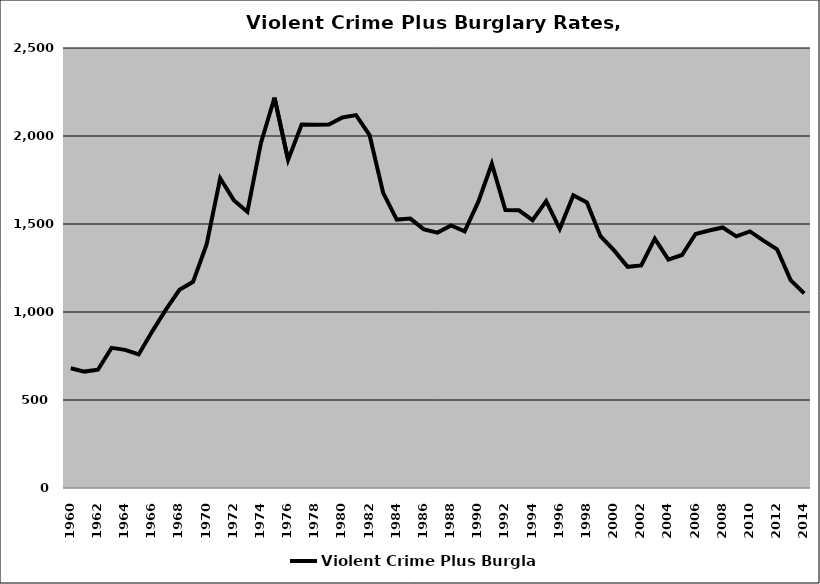
| Category | Violent Crime Plus Burglary |
|---|---|
| 1960.0 | 680.272 |
| 1961.0 | 661.354 |
| 1962.0 | 672.068 |
| 1963.0 | 796.218 |
| 1964.0 | 784.929 |
| 1965.0 | 759.01 |
| 1966.0 | 890.234 |
| 1967.0 | 1012.977 |
| 1968.0 | 1126.217 |
| 1969.0 | 1171.296 |
| 1970.0 | 1383.679 |
| 1971.0 | 1759.677 |
| 1972.0 | 1635.398 |
| 1973.0 | 1569.444 |
| 1974.0 | 1960.908 |
| 1975.0 | 2218.307 |
| 1976.0 | 1864.261 |
| 1977.0 | 2064.777 |
| 1978.0 | 2064.322 |
| 1979.0 | 2064.777 |
| 1980.0 | 2105.32 |
| 1981.0 | 2118.896 |
| 1982.0 | 2004.651 |
| 1983.0 | 1676.568 |
| 1984.0 | 1525.122 |
| 1985.0 | 1530.707 |
| 1986.0 | 1469.352 |
| 1987.0 | 1451.242 |
| 1988.0 | 1492.273 |
| 1989.0 | 1458.692 |
| 1990.0 | 1625.716 |
| 1991.0 | 1841.912 |
| 1992.0 | 1578.81 |
| 1993.0 | 1577.857 |
| 1994.0 | 1522.238 |
| 1995.0 | 1630.265 |
| 1996.0 | 1472.414 |
| 1997.0 | 1663.115 |
| 1998.0 | 1621.909 |
| 1999.0 | 1430.452 |
| 2000.0 | 1350.051 |
| 2001.0 | 1256.843 |
| 2002.0 | 1264.478 |
| 2003.0 | 1416.705 |
| 2004.0 | 1297.964 |
| 2005.0 | 1323.804 |
| 2006.0 | 1443.509 |
| 2007.0 | 1462.711 |
| 2008.0 | 1480.237 |
| 2009.0 | 1429.859 |
| 2010.0 | 1457.791 |
| 2011.0 | 1405.184 |
| 2012.0 | 1356.192 |
| 2013.0 | 1181.531 |
| 2014.0 | 1105.584 |